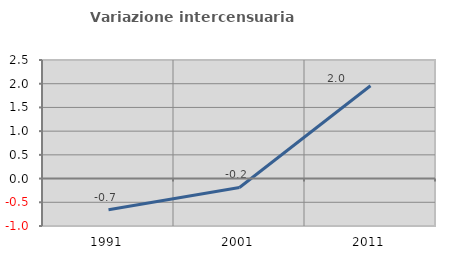
| Category | Variazione intercensuaria annua |
|---|---|
| 1991.0 | -0.657 |
| 2001.0 | -0.187 |
| 2011.0 | 1.957 |